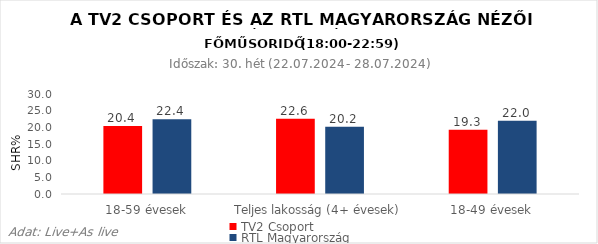
| Category | TV2 Csoport | RTL Magyarország |
|---|---|---|
| 18-59 évesek | 20.4 | 22.4 |
| Teljes lakosság (4+ évesek) | 22.6 | 20.2 |
| 18-49 évesek | 19.3 | 22 |